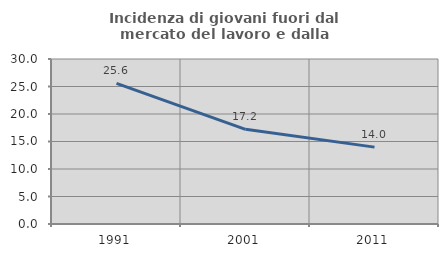
| Category | Incidenza di giovani fuori dal mercato del lavoro e dalla formazione  |
|---|---|
| 1991.0 | 25.568 |
| 2001.0 | 17.219 |
| 2011.0 | 13.978 |